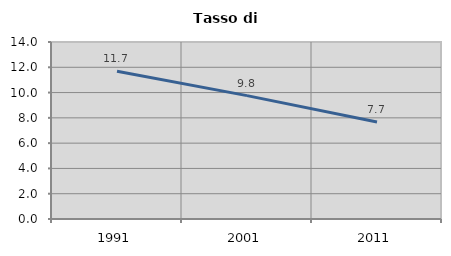
| Category | Tasso di disoccupazione   |
|---|---|
| 1991.0 | 11.69 |
| 2001.0 | 9.757 |
| 2011.0 | 7.674 |